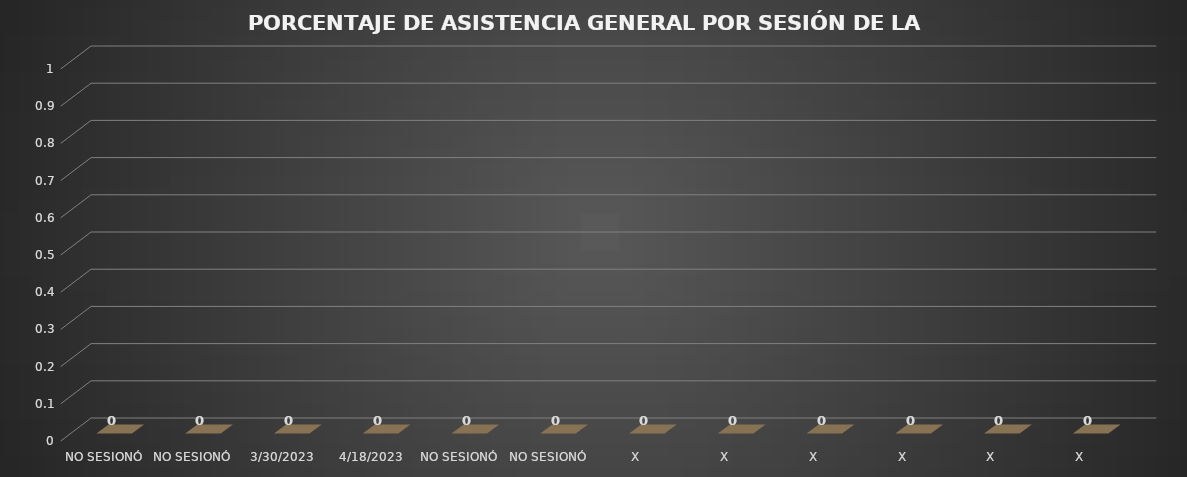
| Category | Series 0 |
|---|---|
| NO SESIONÓ | 0 |
| NO SESIONÓ | 0 |
| 30/03/2023 | 0 |
| 18/04/2023 | 0 |
| NO SESIONÓ | 0 |
| NO SESIONÓ | 0 |
| X | 0 |
| X | 0 |
| X | 0 |
| X | 0 |
| X | 0 |
| X | 0 |